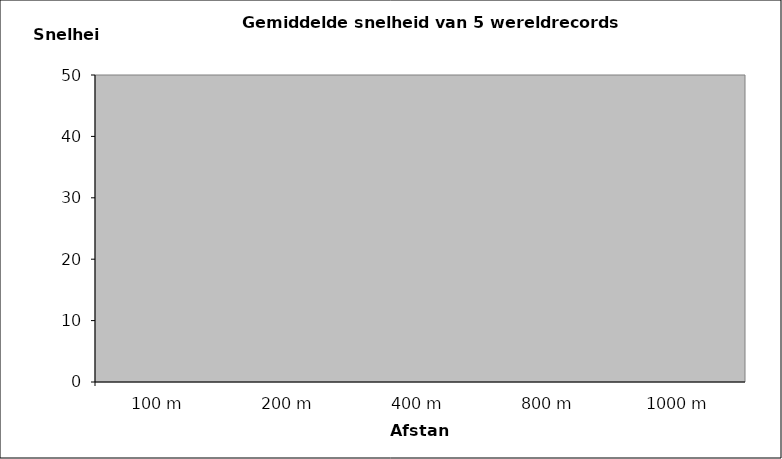
| Category | record_mannen |
|---|---|
| 100.0 | 36.847 |
| 200.0 | 37.267 |
| 400.0 | 33.349 |
| 800.0 | 28.484 |
| 1000.0 | 27.281 |